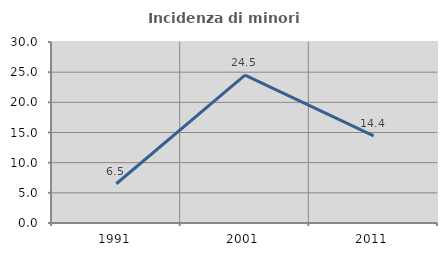
| Category | Incidenza di minori stranieri |
|---|---|
| 1991.0 | 6.504 |
| 2001.0 | 24.51 |
| 2011.0 | 14.431 |